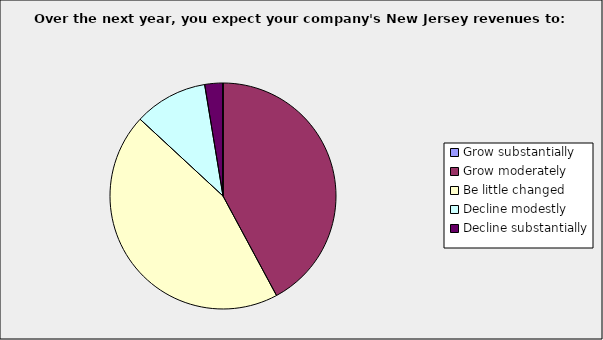
| Category | Series 0 |
|---|---|
| Grow substantially | 0 |
| Grow moderately | 0.421 |
| Be little changed | 0.447 |
| Decline modestly | 0.105 |
| Decline substantially | 0.026 |